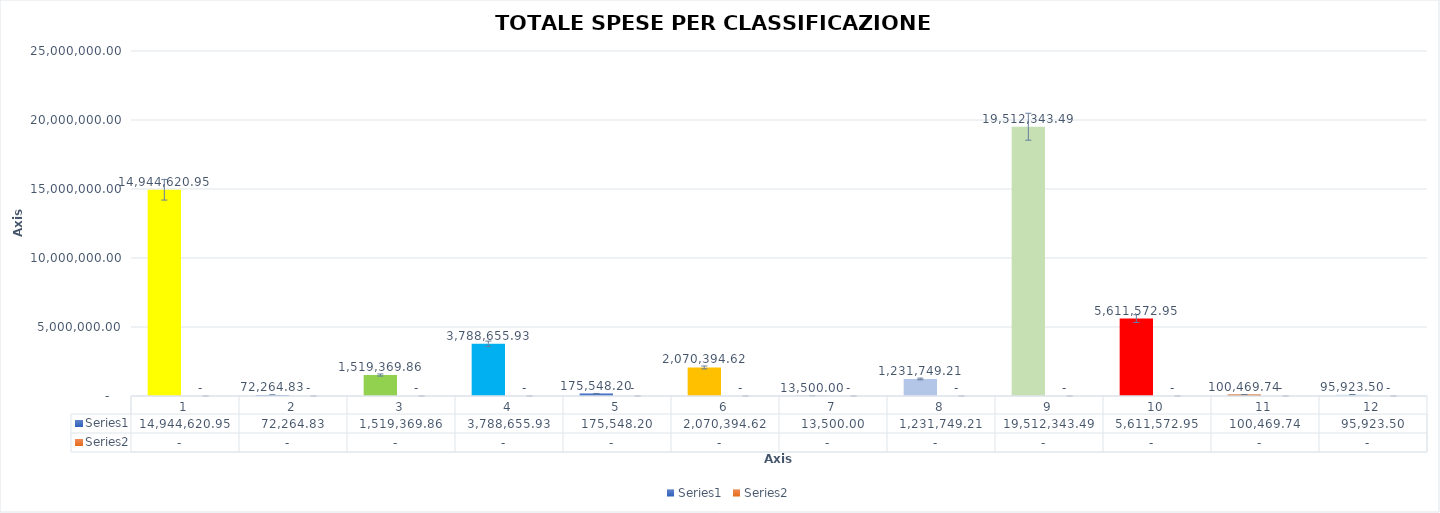
| Category | Series 0 | Series 1 |
|---|---|---|
| 0 | 14944620.95 | 0 |
| 1 | 72264.83 | 0 |
| 2 | 1519369.86 | 0 |
| 3 | 3788655.93 | 0 |
| 4 | 175548.2 | 0 |
| 5 | 2070394.62 | 0 |
| 6 | 13500 | 0 |
| 7 | 1231749.21 | 0 |
| 8 | 19512343.49 | 0 |
| 9 | 5611572.95 | 0 |
| 10 | 100469.74 | 0 |
| 11 | 95923.5 | 0 |